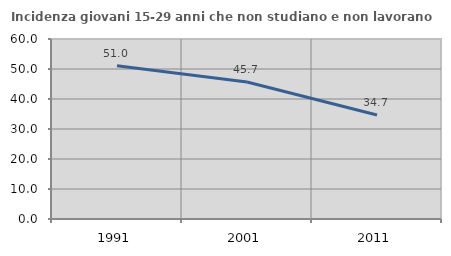
| Category | Incidenza giovani 15-29 anni che non studiano e non lavorano  |
|---|---|
| 1991.0 | 51.049 |
| 2001.0 | 45.658 |
| 2011.0 | 34.68 |